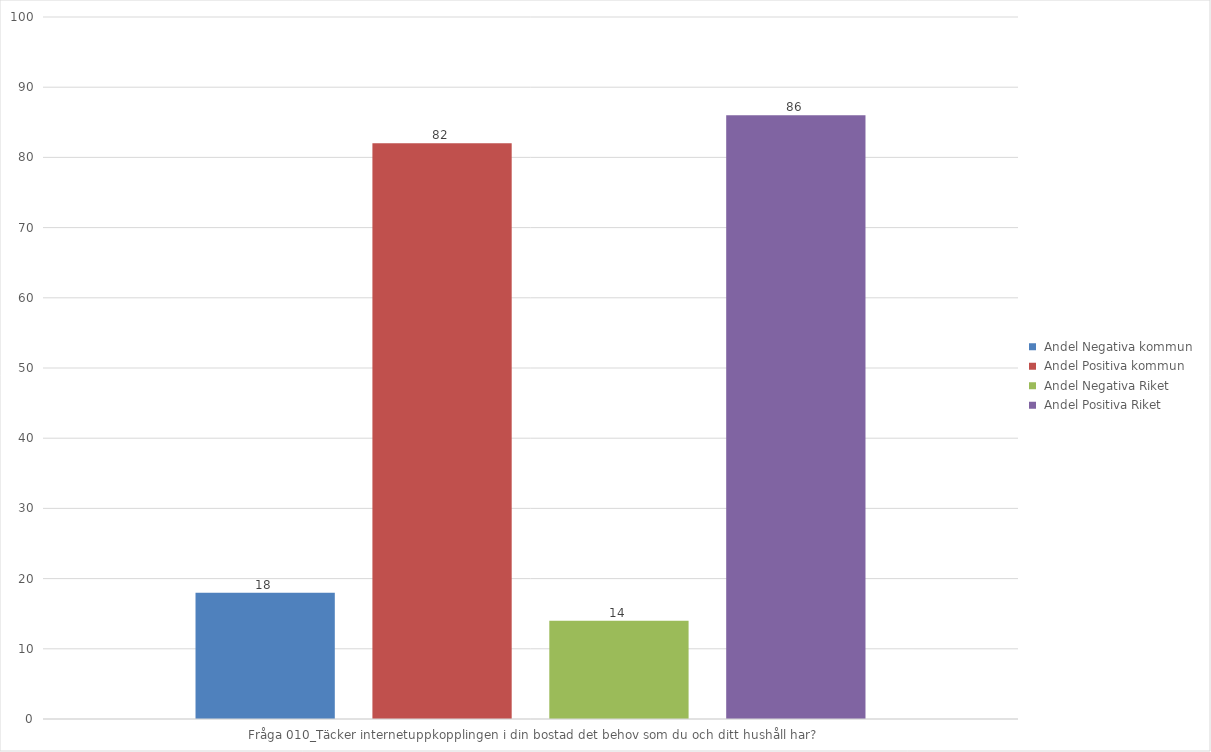
| Category |  Andel Negativa kommun |  Andel Positiva kommun |  Andel Negativa Riket |  Andel Positiva Riket |
|---|---|---|---|---|
| Fråga 010_Täcker internetuppkopplingen i din bostad det behov som du och ditt hushåll har? | 18 | 82 | 14 | 86 |